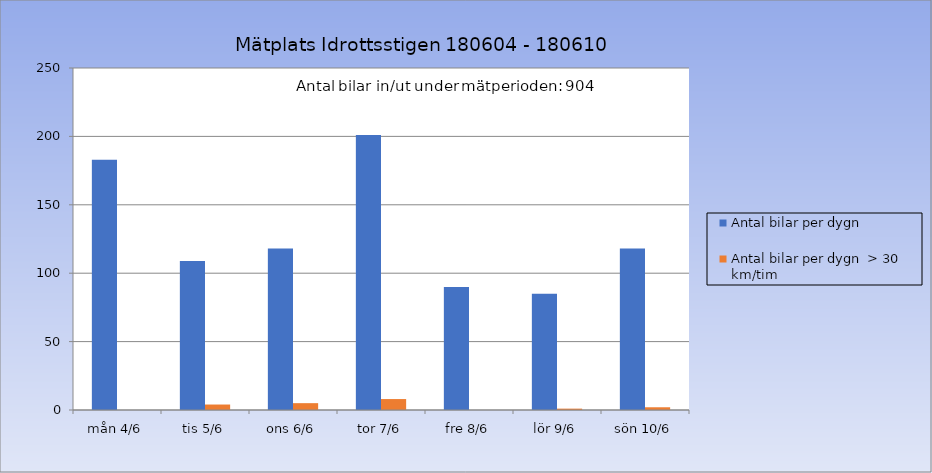
| Category | Antal bilar per dygn | Antal bilar per dygn  > 30 km/tim |
|---|---|---|
| mån 4/6 | 183 | 0 |
| tis 5/6 | 109 | 4 |
| ons 6/6 | 118 | 5 |
| tor 7/6 | 201 | 8 |
| fre 8/6 | 90 | 0 |
| lör 9/6 | 85 | 1 |
| sön 10/6 | 118 | 2 |